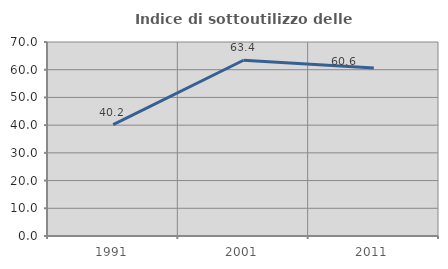
| Category | Indice di sottoutilizzo delle abitazioni  |
|---|---|
| 1991.0 | 40.206 |
| 2001.0 | 63.415 |
| 2011.0 | 60.606 |